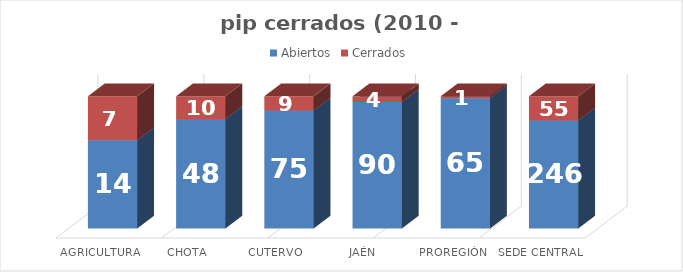
| Category | Abiertos | Cerrados |
|---|---|---|
| Agricultura | 14 | 7 |
| Chota | 48 | 10 |
| Cutervo | 75 | 9 |
| Jaén | 90 | 4 |
| Proregión | 65 | 1 |
| Sede Central | 246 | 55 |